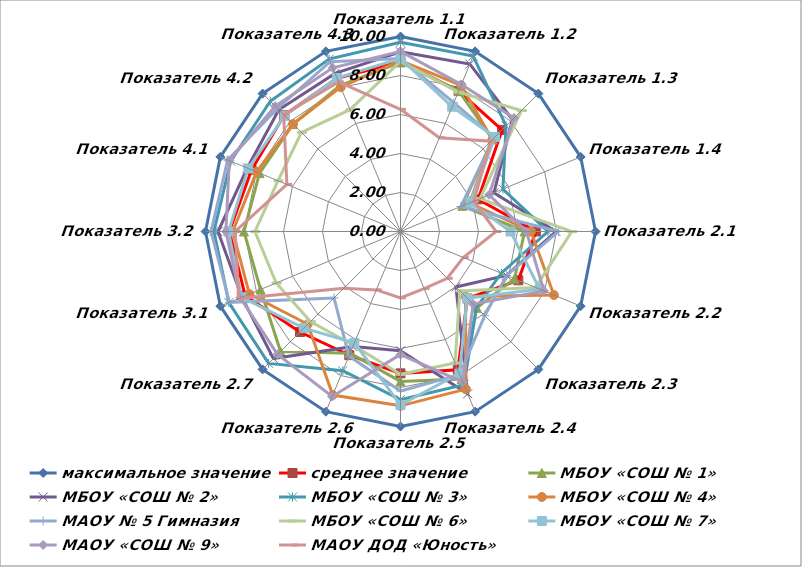
| Category | максимальное значение | среднее значение | МБОУ «СОШ № 1» | МБОУ «СОШ № 2» | МБОУ «СОШ № 3» | МБОУ «СОШ № 4» | МАОУ № 5 Гимназия | МБОУ «СОШ № 6» | МБОУ «СОШ № 7» | МАОУ «СОШ № 9» | МАОУ ДОД «Юность» |
|---|---|---|---|---|---|---|---|---|---|---|---|
| Показатель 1.1 | 10 | 8.703 | 8.668 | 9.213 | 9.704 | 8.767 | 8.872 | 8.725 | 8.879 | 9.236 | 6.265 |
| Показатель 1.2 | 10 | 7.793 | 7.808 | 9.295 | 9.741 | 8.116 | 7.147 | 7.738 | 6.925 | 8.16 | 5.205 |
| Показатель 1.3 | 10 | 7.368 | 6.676 | 8.112 | 7.656 | 6.662 | 6.802 | 8.771 | 6.85 | 8.232 | 6.553 |
| Показатель 1.4 | 10 | 4.308 | 3.435 | 5.186 | 5.684 | 3.841 | 3.347 | 4.41 | 3.882 | 4.92 | 4.068 |
| Показатель 2.1 | 10 | 6.942 | 6.365 | 7.969 | 7.56 | 6.692 | 8.102 | 8.783 | 5.643 | 6.459 | 4.902 |
| Показатель 2.2 | 10 | 6.541 | 6.329 | 5.881 | 5.593 | 8.514 | 5.889 | 7.495 | 7.721 | 7.961 | 3.483 |
| Показатель 2.3 | 10 | 4.854 | 5.531 | 4.019 | 5.513 | 4.717 | 6.105 | 4.306 | 4.834 | 5.267 | 3.392 |
| Показатель 2.4 | 10 | 7.678 | 8.184 | 9.008 | 8.504 | 8.748 | 7.944 | 7.301 | 7.886 | 8.358 | 3.167 |
| Показатель 2.5 | 10 | 7.275 | 7.688 | 6.118 | 8.62 | 8.941 | 8.18 | 7.323 | 8.891 | 6.311 | 3.403 |
| Показатель 2.6 | 10 | 6.862 | 6.76 | 6.385 | 7.725 | 9.079 | 6.915 | 6.312 | 6.182 | 9.158 | 3.241 |
| Показатель 2.7 | 10 | 7.288 | 8.699 | 9.215 | 9.565 | 6.729 | 4.819 | 6.531 | 7.012 | 8.915 | 4.111 |
| Показатель 3.1 | 10 | 8.62 | 7.77 | 8.807 | 9.527 | 8.385 | 9.496 | 6.901 | 8.822 | 8.889 | 8.983 |
| Показатель 3.2 | 10 | 8.776 | 8.03 | 9.358 | 9.568 | 8.602 | 9.712 | 7.465 | 8.822 | 8.954 | 8.475 |
| Показатель 4.1 | 10 | 8.266 | 7.825 | 8.505 | 9.425 | 7.992 | 9.595 | 6.8 | 8.447 | 9.5 | 6.308 |
| Показатель 4.2 | 10 | 8.435 | 7.788 | 8.823 | 9.444 | 7.795 | 8.921 | 7.183 | 8.401 | 9.085 | 8.475 |
| Показатель 4.3 | 10 | 8.506 | 8.104 | 8.777 | 9.568 | 8.012 | 9.424 | 6.761 | 8.519 | 9.085 | 8.305 |